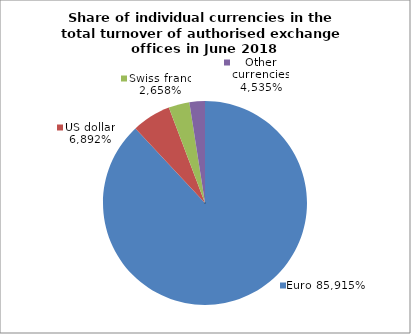
| Category | EUR |
|---|---|
| 0 | 0.881 |
| 1 | 0.062 |
| 2 | 0.033 |
| 3 | 0.025 |